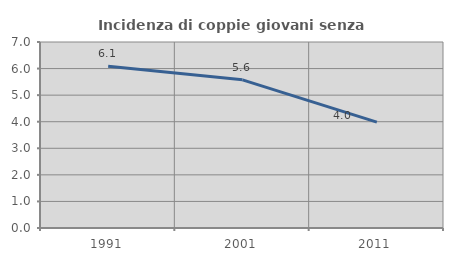
| Category | Incidenza di coppie giovani senza figli |
|---|---|
| 1991.0 | 6.084 |
| 2001.0 | 5.576 |
| 2011.0 | 3.986 |